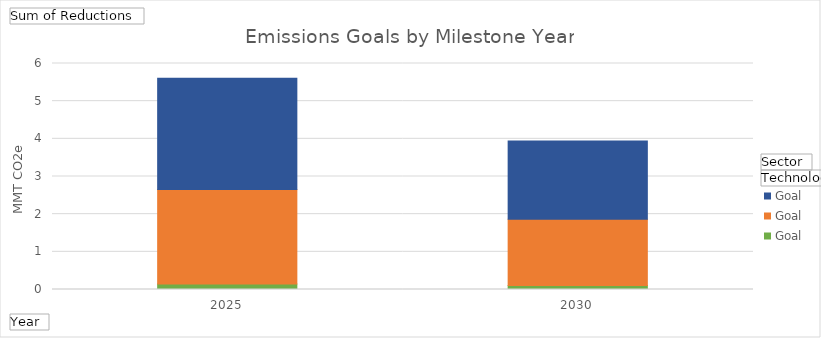
| Category | Electric - Goal | Thermal - Goal | Transportation - Goal |
|---|---|---|---|
| 2025 | 0.148 | 2.508 | 2.951 |
| 2030 | 0.104 | 1.763 | 2.074 |